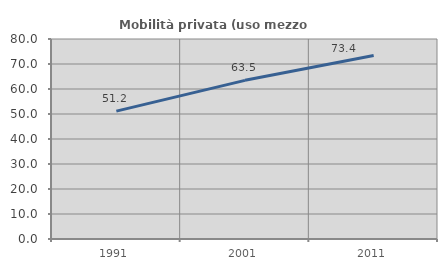
| Category | Mobilità privata (uso mezzo privato) |
|---|---|
| 1991.0 | 51.154 |
| 2001.0 | 63.466 |
| 2011.0 | 73.431 |